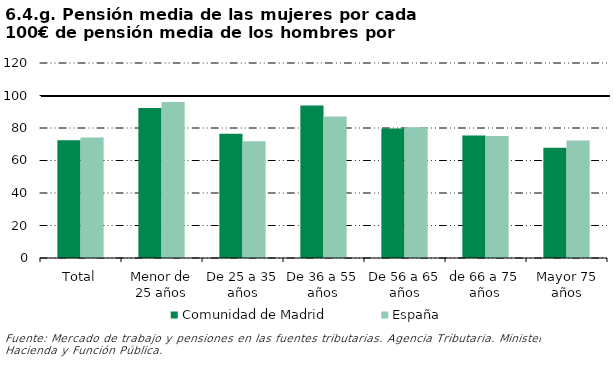
| Category | Comunidad de Madrid | España |
|---|---|---|
| Total | 72.447 | 74.218 |
| Menor de 25 años | 92.342 | 95.942 |
| De 25 a 35 años | 76.456 | 71.882 |
| De 36 a 55 años | 93.793 | 87.066 |
| De 56 a 65 años | 79.734 | 80.427 |
| de 66 a 75 años | 75.314 | 75.09 |
| Mayor 75 años | 67.901 | 72.274 |